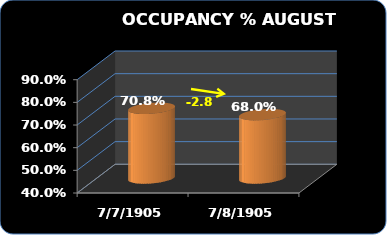
| Category | Occupancy % |
|---|---|
| 2016.0 | 0.68 |
| 2015.0 | 0.708 |